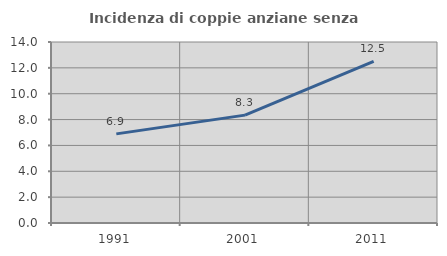
| Category | Incidenza di coppie anziane senza figli  |
|---|---|
| 1991.0 | 6.894 |
| 2001.0 | 8.345 |
| 2011.0 | 12.498 |